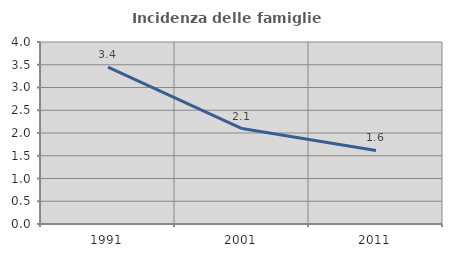
| Category | Incidenza delle famiglie numerose |
|---|---|
| 1991.0 | 3.448 |
| 2001.0 | 2.097 |
| 2011.0 | 1.616 |